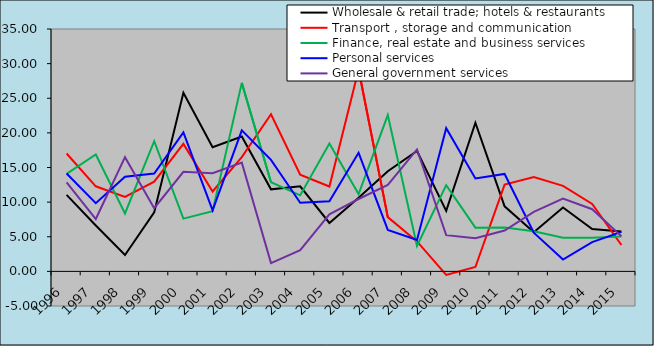
| Category | Wholesale & retail trade; hotels & restaurants | Transport , storage and communication | Finance, real estate and business services | Personal services | General government services |
|---|---|---|---|---|---|
| 1996.0 | 11.045 | 17.017 | 14.077 | 14.136 | 12.867 |
| 1997.0 | 6.617 | 12.283 | 16.872 | 9.852 | 7.56 |
| 1998.0 | 2.368 | 10.763 | 8.362 | 13.666 | 16.497 |
| 1999.0 | 8.517 | 12.952 | 18.805 | 14.129 | 9.134 |
| 2000.0 | 25.788 | 18.412 | 7.613 | 20.067 | 14.374 |
| 2001.0 | 17.929 | 11.543 | 8.677 | 8.826 | 14.167 |
| 2002.0 | 19.479 | 16.493 | 27.223 | 20.374 | 15.705 |
| 2003.0 | 11.844 | 22.697 | 12.878 | 16.108 | 1.194 |
| 2004.0 | 12.281 | 13.963 | 10.982 | 9.905 | 3.05 |
| 2005.0 | 6.986 | 12.253 | 18.468 | 10.133 | 8.235 |
| 2006.0 | 10.636 | 29.158 | 11.163 | 17.126 | 10.452 |
| 2007.0 | 14.464 | 7.832 | 22.571 | 5.987 | 12.496 |
| 2008.0 | 17.392 | 4.327 | 3.676 | 4.536 | 17.602 |
| 2009.0 | 8.73 | -0.522 | 12.447 | 20.684 | 5.235 |
| 2010.0 | 21.464 | 0.636 | 6.313 | 13.426 | 4.772 |
| 2011.0 | 9.396 | 12.527 | 6.344 | 14.068 | 5.902 |
| 2012.0 | 5.654 | 13.635 | 5.782 | 5.58 | 8.589 |
| 2013.0 | 9.23 | 12.347 | 4.861 | 1.699 | 10.502 |
| 2014.0 | 6.126 | 9.739 | 4.87 | 4.227 | 8.979 |
| 2015.0 | 5.762 | 3.814 | 5.05 | 5.702 | 5.079 |